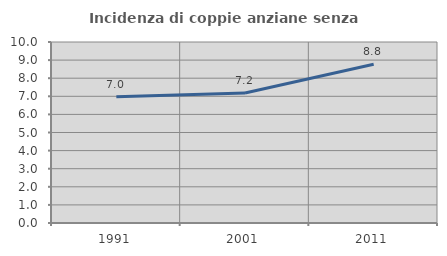
| Category | Incidenza di coppie anziane senza figli  |
|---|---|
| 1991.0 | 6.977 |
| 2001.0 | 7.186 |
| 2011.0 | 8.772 |